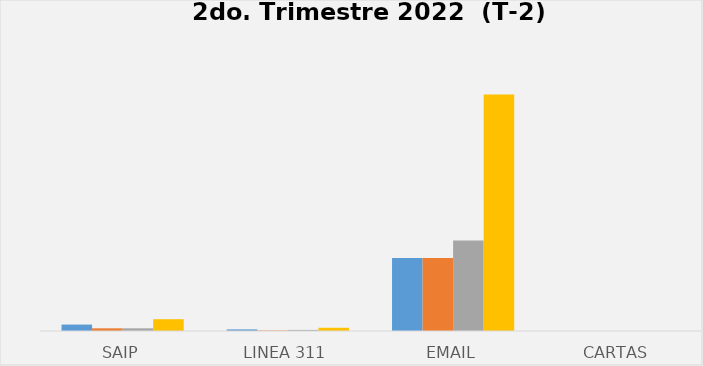
| Category | Series 0 | Series 1 | Series 2 | Series 3 |
|---|---|---|---|---|
| SAIP | 12 | 5 | 5 | 22 |
| Linea 311 | 3 | 1 | 2 | 6 |
| Email | 136 | 136 | 169 | 441 |
| Cartas | 0 | 0 | 0 | 0 |